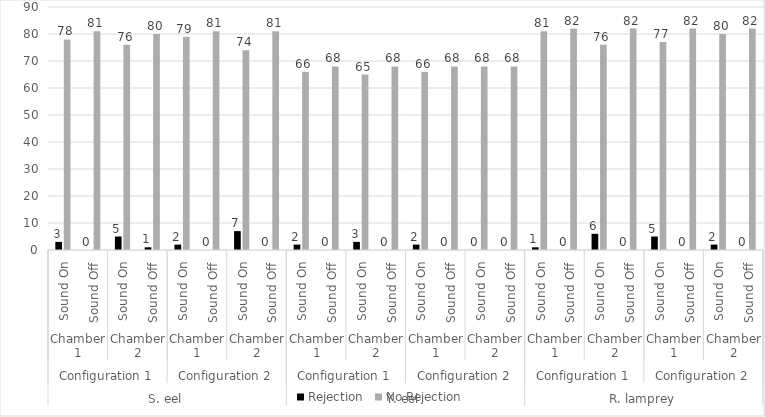
| Category | Rejection | No Rejection |
|---|---|---|
| 0 | 3 | 78 |
| 1 | 0 | 81 |
| 2 | 5 | 76 |
| 3 | 1 | 80 |
| 4 | 2 | 79 |
| 5 | 0 | 81 |
| 6 | 7 | 74 |
| 7 | 0 | 81 |
| 8 | 2 | 66 |
| 9 | 0 | 68 |
| 10 | 3 | 65 |
| 11 | 0 | 68 |
| 12 | 2 | 66 |
| 13 | 0 | 68 |
| 14 | 0 | 68 |
| 15 | 0 | 68 |
| 16 | 1 | 81 |
| 17 | 0 | 82 |
| 18 | 6 | 76 |
| 19 | 0 | 82 |
| 20 | 5 | 77 |
| 21 | 0 | 82 |
| 22 | 2 | 80 |
| 23 | 0 | 82 |